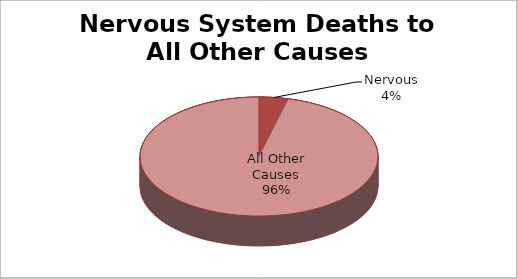
| Category | Series 0 |
|---|---|
| Nervous | 1 |
| All Other Causes | 24 |